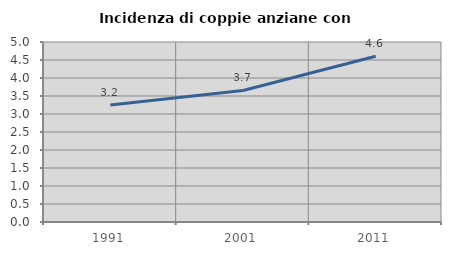
| Category | Incidenza di coppie anziane con figli |
|---|---|
| 1991.0 | 3.249 |
| 2001.0 | 3.654 |
| 2011.0 | 4.606 |